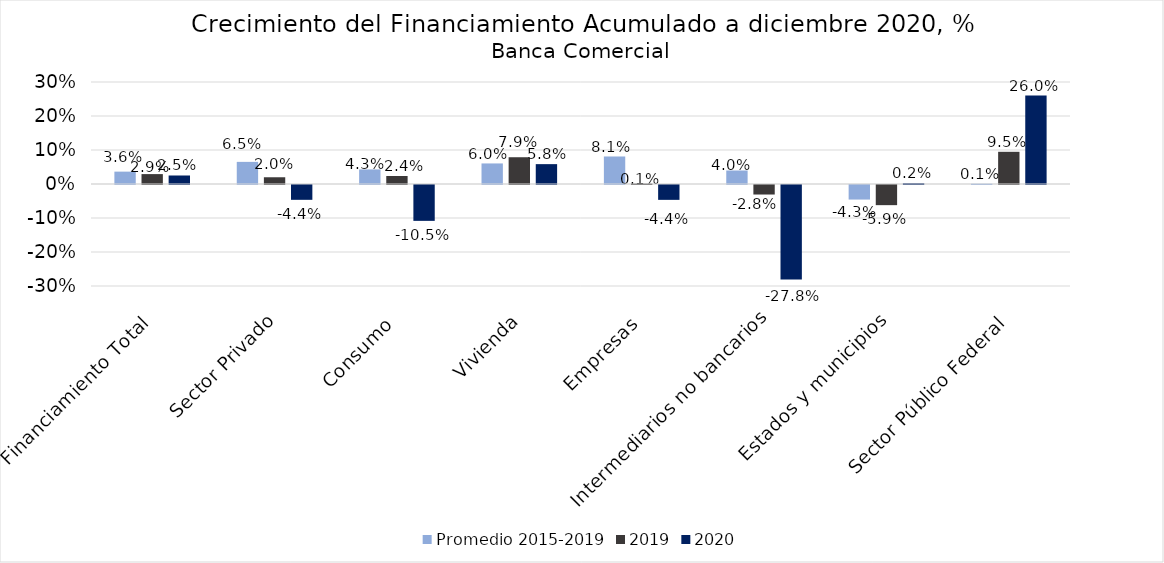
| Category | Promedio 2015-2019 | 2019 | 2020 |
|---|---|---|---|
| Financiamiento Total  | 0.036 | 0.029 | 0.025 |
| Sector Privado | 0.065 | 0.02 | -0.044 |
| Consumo | 0.043 | 0.024 | -0.105 |
| Vivienda | 0.06 | 0.079 | 0.058 |
| Empresas | 0.081 | 0.001 | -0.044 |
| Intermediarios no bancarios | 0.04 | -0.028 | -0.278 |
| Estados y municipios | -0.043 | -0.059 | 0.002 |
| Sector Público Federal | 0.001 | 0.095 | 0.26 |